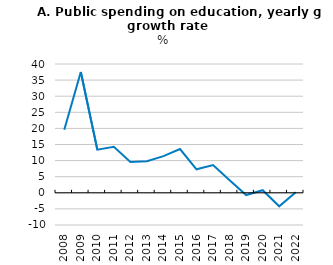
| Category | Public spending in education, yearly growth rate, % |
|---|---|
| 2008.0 | 19.6 |
| 2009.0 | 37.5 |
| 2010.0 | 13.4 |
| 2011.0 | 14.3 |
| 2012.0 | 9.6 |
| 2013.0 | 9.8 |
| 2014.0 | 11.4 |
| 2015.0 | 13.6 |
| 2016.0 | 7.3 |
| 2017.0 | 8.6 |
| 2018.0 | 3.9 |
| 2019.0 | -0.7 |
| 2020.0 | 0.8 |
| 2021.0 | -4.2 |
| 2022.0 | 0.2 |